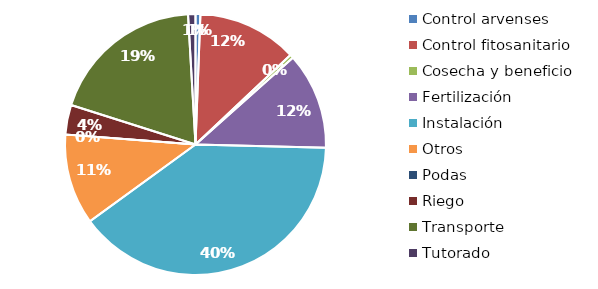
| Category | Valor |
|---|---|
| Control arvenses | 542489 |
| Control fitosanitario | 11184015 |
| Cosecha y beneficio | 397975.352 |
| Fertilización | 10827998 |
| Instalación | 35817781.69 |
| Otros | 10161637 |
| Podas | 0 |
| Riego | 3316461 |
| Transporte | 17352761 |
| Tutorado | 829115 |